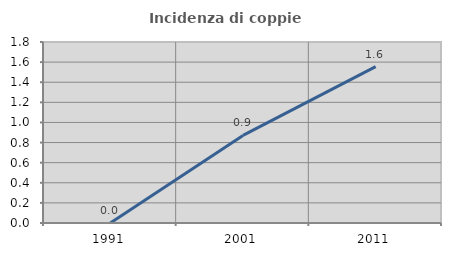
| Category | Incidenza di coppie miste |
|---|---|
| 1991.0 | 0 |
| 2001.0 | 0.871 |
| 2011.0 | 1.554 |